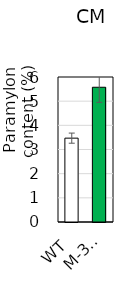
| Category | CM |
|---|---|
| 0 | 3.47 |
| 1 | 5.575 |